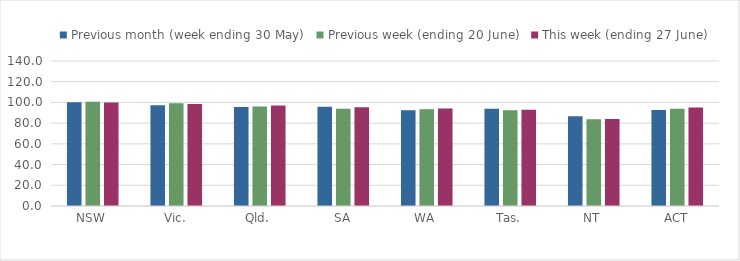
| Category | Previous month (week ending 30 May) | Previous week (ending 20 June) | This week (ending 27 June) |
|---|---|---|---|
| NSW | 100.28 | 100.578 | 99.838 |
| Vic. | 97.284 | 99.108 | 98.387 |
| Qld. | 95.5 | 95.963 | 96.965 |
| SA | 95.866 | 93.932 | 95.308 |
| WA | 92.406 | 93.375 | 94.035 |
| Tas. | 93.888 | 92.431 | 92.937 |
| NT | 86.667 | 83.66 | 83.956 |
| ACT | 92.617 | 93.96 | 95.154 |